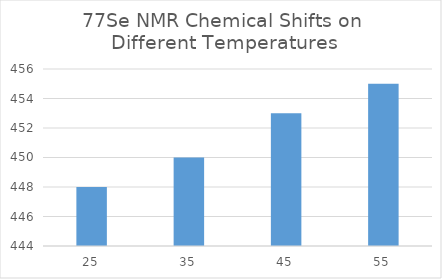
| Category | Series 0 |
|---|---|
| 25.0 | 448 |
| 35.0 | 450 |
| 45.0 | 453 |
| 55.0 | 455 |